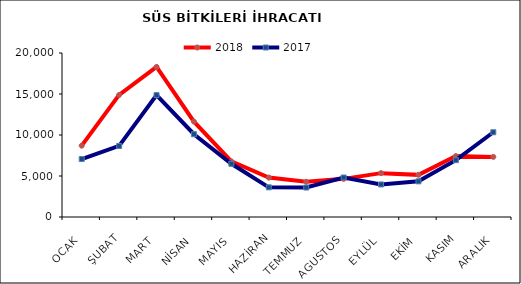
| Category | 2018 | 2017 |
|---|---|---|
| OCAK | 8699.759 | 7065.887 |
| ŞUBAT | 14888.559 | 8665.687 |
| MART | 18298.715 | 14861.444 |
| NİSAN | 11630.613 | 10094.82 |
| MAYIS | 6780.411 | 6492.509 |
| HAZİRAN | 4806.903 | 3619.612 |
| TEMMUZ | 4293.794 | 3592.526 |
| AGUSTOS | 4651.772 | 4815.23 |
| EYLÜL | 5349.46 | 3969.217 |
| EKİM | 5137.693 | 4347.459 |
| KASIM | 7430.704 | 6933.812 |
| ARALIK | 7331.325 | 10334.591 |